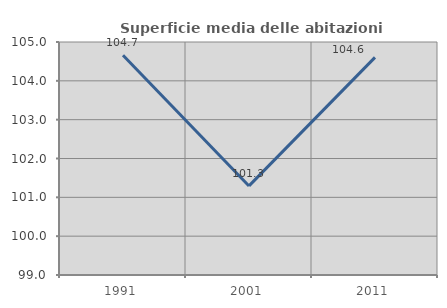
| Category | Superficie media delle abitazioni occupate |
|---|---|
| 1991.0 | 104.658 |
| 2001.0 | 101.294 |
| 2011.0 | 104.605 |